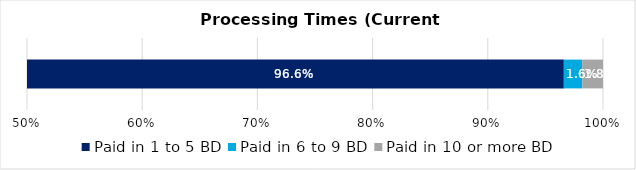
| Category | Paid in 1 to 5 BD | Paid in 6 to 9 BD | Paid in 10 or more BD |
|---|---|---|---|
| 0 | 0.966 | 0.016 | 0.018 |